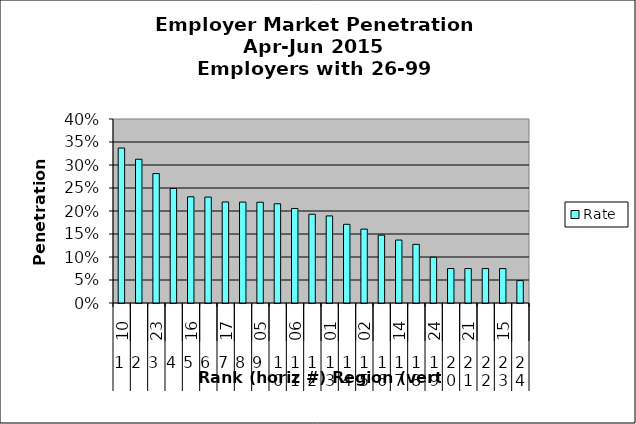
| Category | Rate |
|---|---|
| 0 | 0.337 |
| 1 | 0.312 |
| 2 | 0.281 |
| 3 | 0.249 |
| 4 | 0.231 |
| 5 | 0.23 |
| 6 | 0.22 |
| 7 | 0.219 |
| 8 | 0.219 |
| 9 | 0.216 |
| 10 | 0.205 |
| 11 | 0.193 |
| 12 | 0.189 |
| 13 | 0.171 |
| 14 | 0.161 |
| 15 | 0.148 |
| 16 | 0.137 |
| 17 | 0.128 |
| 18 | 0.1 |
| 19 | 0.075 |
| 20 | 0.075 |
| 21 | 0.075 |
| 22 | 0.075 |
| 23 | 0.049 |